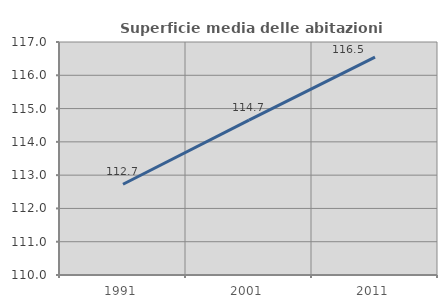
| Category | Superficie media delle abitazioni occupate |
|---|---|
| 1991.0 | 112.726 |
| 2001.0 | 114.653 |
| 2011.0 | 116.546 |